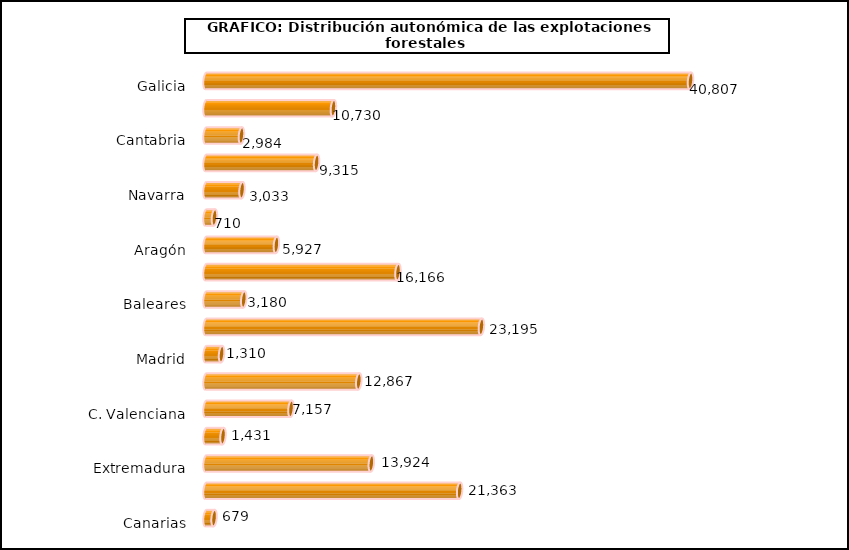
| Category | num. Explotaciones |
|---|---|
|   Galicia | 40807 |
|   P. de Asturias | 10730 |
|   Cantabria | 2984 |
|   País Vasco | 9315 |
|   Navarra | 3033 |
|   La Rioja | 710 |
|   Aragón | 5927 |
|   Cataluña | 16166 |
|   Baleares | 3180 |
|   Castilla y León | 23195 |
|   Madrid | 1310 |
|   Castilla-La Mancha | 12867 |
|   C. Valenciana | 7157 |
|   R. de Murcia | 1431 |
|   Extremadura | 13924 |
|   Andalucía | 21363 |
|   Canarias | 679 |